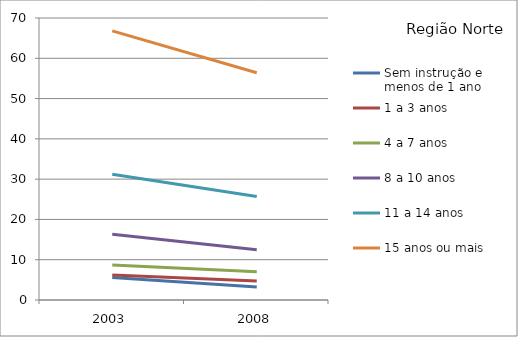
| Category | Sem instrução e menos de 1 ano | 1 a 3 anos | 4 a 7 anos | 8 a 10 anos | 11 a 14 anos | 15 anos ou mais |
|---|---|---|---|---|---|---|
| 2003.0 | 5.6 | 6.2 | 8.7 | 16.3 | 31.2 | 66.8 |
| 2008.0 | 3.2 | 4.7 | 7 | 12.5 | 25.7 | 56.4 |